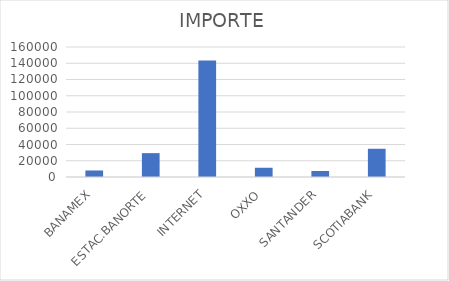
| Category | IMPORTE |
|---|---|
| BANAMEX | 8027.65 |
| ESTAC.BANORTE | 29355.32 |
| INTERNET | 143496.89 |
| OXXO | 11377.79 |
| SANTANDER | 7358.85 |
| SCOTIABANK | 34745.82 |